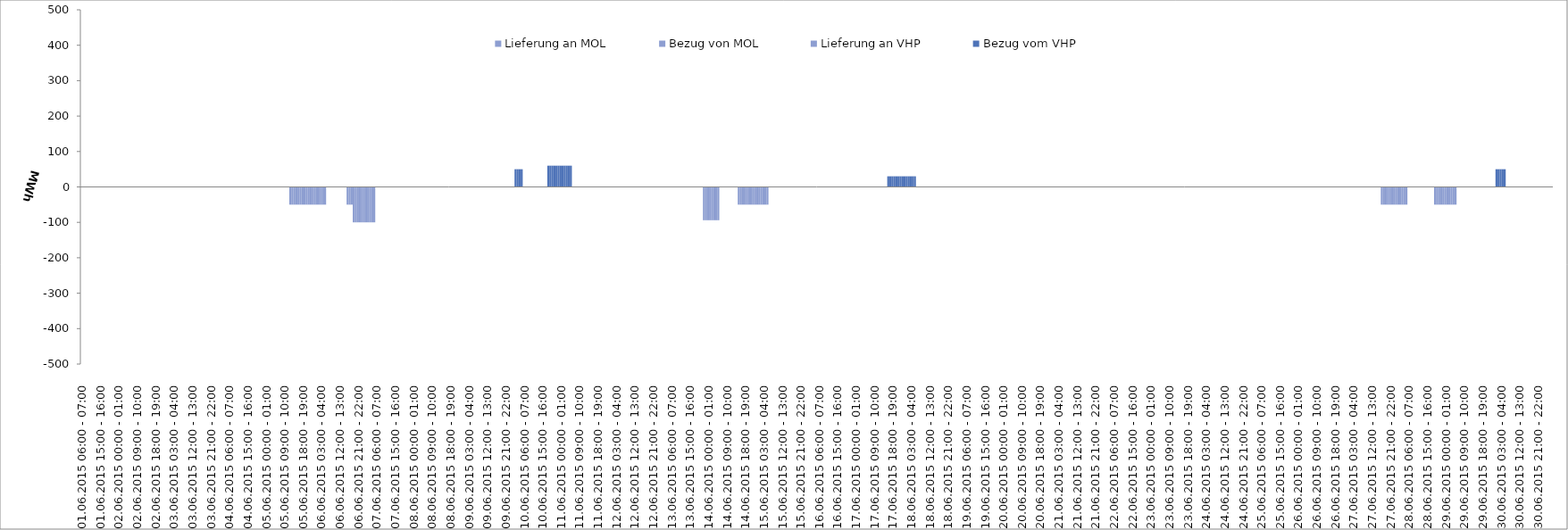
| Category | Bezug vom VHP | Lieferung an VHP | Bezug von MOL | Lieferung an MOL |
|---|---|---|---|---|
| 01.06.2015 06:00 - 07:00 | 0 | 0 | 0 | 0 |
| 01.06.2015 07:00 - 08:00 | 0 | 0 | 0 | 0 |
| 01.06.2015 08:00 - 09:00 | 0 | 0 | 0 | 0 |
| 01.06.2015 09:00 - 10:00 | 0 | 0 | 0 | 0 |
| 01.06.2015 10:00 - 11:00 | 0 | 0 | 0 | 0 |
| 01.06.2015 11:00 - 12:00 | 0 | 0 | 0 | 0 |
| 01.06.2015 12:00 - 13:00 | 0 | 0 | 0 | 0 |
| 01.06.2015 13:00 - 14:00 | 0 | 0 | 0 | 0 |
| 01.06.2015 14:00 - 15:00 | 0 | 0 | 0 | 0 |
| 01.06.2015 15:00 - 16:00 | 0 | 0 | 0 | 0 |
| 01.06.2015 16:00 - 17:00 | 0 | 0 | 0 | 0 |
| 01.06.2015 17:00 - 18:00 | 0 | 0 | 0 | 0 |
| 01.06.2015 18:00 - 19:00 | 0 | 0 | 0 | 0 |
| 01.06.2015 19:00 - 20:00 | 0 | 0 | 0 | 0 |
| 01.06.2015 20:00 - 21:00 | 0 | 0 | 0 | 0 |
| 01.06.2015 21:00 - 22:00 | 0 | 0 | 0 | 0 |
| 01.06.2015 22:00 - 23:00 | 0 | 0 | 0 | 0 |
| 01.06.2015 23:00 - 24:00 | 0 | 0 | 0 | 0 |
| 02.06.2015 00:00 - 01:00 | 0 | 0 | 0 | 0 |
| 02.06.2015 01:00 - 02:00 | 0 | 0 | 0 | 0 |
| 02.06.2015 02:00 - 03:00 | 0 | 0 | 0 | 0 |
| 02.06.2015 03:00 - 04:00 | 0 | 0 | 0 | 0 |
| 02.06.2015 04:00 - 05:00 | 0 | 0 | 0 | 0 |
| 02.06.2015 05:00 - 06:00 | 0 | 0 | 0 | 0 |
| 02.06.2015 06:00 - 07:00 | 0 | 0 | 0 | 0 |
| 02.06.2015 07:00 - 08:00 | 0 | 0 | 0 | 0 |
| 02.06.2015 08:00 - 09:00 | 0 | 0 | 0 | 0 |
| 02.06.2015 09:00 - 10:00 | 0 | 0 | 0 | 0 |
| 02.06.2015 10:00 - 11:00 | 0 | 0 | 0 | 0 |
| 02.06.2015 11:00 - 12:00 | 0 | 0 | 0 | 0 |
| 02.06.2015 12:00 - 13:00 | 0 | 0 | 0 | 0 |
| 02.06.2015 13:00 - 14:00 | 0 | 0 | 0 | 0 |
| 02.06.2015 14:00 - 15:00 | 0 | 0 | 0 | 0 |
| 02.06.2015 15:00 - 16:00 | 0 | 0 | 0 | 0 |
| 02.06.2015 16:00 - 17:00 | 0 | 0 | 0 | 0 |
| 02.06.2015 17:00 - 18:00 | 0 | 0 | 0 | 0 |
| 02.06.2015 18:00 - 19:00 | 0 | 0 | 0 | 0 |
| 02.06.2015 19:00 - 20:00 | 0 | 0 | 0 | 0 |
| 02.06.2015 20:00 - 21:00 | 0 | 0 | 0 | 0 |
| 02.06.2015 21:00 - 22:00 | 0 | 0 | 0 | 0 |
| 02.06.2015 22:00 - 23:00 | 0 | 0 | 0 | 0 |
| 02.06.2015 23:00 - 24:00 | 0 | 0 | 0 | 0 |
| 03.06.2015 00:00 - 01:00 | 0 | 0 | 0 | 0 |
| 03.06.2015 01:00 - 02:00 | 0 | 0 | 0 | 0 |
| 03.06.2015 02:00 - 03:00 | 0 | 0 | 0 | 0 |
| 03.06.2015 03:00 - 04:00 | 0 | 0 | 0 | 0 |
| 03.06.2015 04:00 - 05:00 | 0 | 0 | 0 | 0 |
| 03.06.2015 05:00 - 06:00 | 0 | 0 | 0 | 0 |
| 03.06.2015 06:00 - 07:00 | 0 | 0 | 0 | 0 |
| 03.06.2015 07:00 - 08:00 | 0 | 0 | 0 | 0 |
| 03.06.2015 08:00 - 09:00 | 0 | 0 | 0 | 0 |
| 03.06.2015 09:00 - 10:00 | 0 | 0 | 0 | 0 |
| 03.06.2015 10:00 - 11:00 | 0 | 0 | 0 | 0 |
| 03.06.2015 11:00 - 12:00 | 0 | 0 | 0 | 0 |
| 03.06.2015 12:00 - 13:00 | 0 | 0 | 0 | 0 |
| 03.06.2015 13:00 - 14:00 | 0 | 0 | 0 | 0 |
| 03.06.2015 14:00 - 15:00 | 0 | 0 | 0 | 0 |
| 03.06.2015 15:00 - 16:00 | 0 | 0 | 0 | 0 |
| 03.06.2015 16:00 - 17:00 | 0 | 0 | 0 | 0 |
| 03.06.2015 17:00 - 18:00 | 0 | 0 | 0 | 0 |
| 03.06.2015 18:00 - 19:00 | 0 | 0 | 0 | 0 |
| 03.06.2015 19:00 - 20:00 | 0 | 0 | 0 | 0 |
| 03.06.2015 20:00 - 21:00 | 0 | 0 | 0 | 0 |
| 03.06.2015 21:00 - 22:00 | 0 | 0 | 0 | 0 |
| 03.06.2015 22:00 - 23:00 | 0 | 0 | 0 | 0 |
| 03.06.2015 23:00 - 24:00 | 0 | 0 | 0 | 0 |
| 04.06.2015 00:00 - 01:00 | 0 | 0 | 0 | 0 |
| 04.06.2015 01:00 - 02:00 | 0 | 0 | 0 | 0 |
| 04.06.2015 02:00 - 03:00 | 0 | 0 | 0 | 0 |
| 04.06.2015 03:00 - 04:00 | 0 | 0 | 0 | 0 |
| 04.06.2015 04:00 - 05:00 | 0 | 0 | 0 | 0 |
| 04.06.2015 05:00 - 06:00 | 0 | 0 | 0 | 0 |
| 04.06.2015 06:00 - 07:00 | 0 | 0 | 0 | 0 |
| 04.06.2015 07:00 - 08:00 | 0 | 0 | 0 | 0 |
| 04.06.2015 08:00 - 09:00 | 0 | 0 | 0 | 0 |
| 04.06.2015 09:00 - 10:00 | 0 | 0 | 0 | 0 |
| 04.06.2015 10:00 - 11:00 | 0 | 0 | 0 | 0 |
| 04.06.2015 11:00 - 12:00 | 0 | 0 | 0 | 0 |
| 04.06.2015 12:00 - 13:00 | 0 | 0 | 0 | 0 |
| 04.06.2015 13:00 - 14:00 | 0 | 0 | 0 | 0 |
| 04.06.2015 14:00 - 15:00 | 0 | 0 | 0 | 0 |
| 04.06.2015 15:00 - 16:00 | 0 | 0 | 0 | 0 |
| 04.06.2015 16:00 - 17:00 | 0 | 0 | 0 | 0 |
| 04.06.2015 17:00 - 18:00 | 0 | 0 | 0 | 0 |
| 04.06.2015 18:00 - 19:00 | 0 | 0 | 0 | 0 |
| 04.06.2015 19:00 - 20:00 | 0 | 0 | 0 | 0 |
| 04.06.2015 20:00 - 21:00 | 0 | 0 | 0 | 0 |
| 04.06.2015 21:00 - 22:00 | 0 | 0 | 0 | 0 |
| 04.06.2015 22:00 - 23:00 | 0 | 0 | 0 | 0 |
| 04.06.2015 23:00 - 24:00 | 0 | 0 | 0 | 0 |
| 05.06.2015 00:00 - 01:00 | 0 | 0 | 0 | 0 |
| 05.06.2015 01:00 - 02:00 | 0 | 0 | 0 | 0 |
| 05.06.2015 02:00 - 03:00 | 0 | 0 | 0 | 0 |
| 05.06.2015 03:00 - 04:00 | 0 | 0 | 0 | 0 |
| 05.06.2015 04:00 - 05:00 | 0 | 0 | 0 | 0 |
| 05.06.2015 05:00 - 06:00 | 0 | 0 | 0 | 0 |
| 05.06.2015 06:00 - 07:00 | 0 | 0 | 0 | 0 |
| 05.06.2015 07:00 - 08:00 | 0 | 0 | 0 | 0 |
| 05.06.2015 08:00 - 09:00 | 0 | 0 | 0 | 0 |
| 05.06.2015 09:00 - 10:00 | 0 | 0 | 0 | 0 |
| 05.06.2015 10:00 - 11:00 | 0 | 0 | 0 | 0 |
| 05.06.2015 11:00 - 12:00 | 0 | 0 | 0 | 0 |
| 05.06.2015 12:00 - 13:00 | 0 | -50 | 0 | 0 |
| 05.06.2015 13:00 - 14:00 | 0 | -50 | 0 | 0 |
| 05.06.2015 14:00 - 15:00 | 0 | -50 | 0 | 0 |
| 05.06.2015 15:00 - 16:00 | 0 | -50 | 0 | 0 |
| 05.06.2015 16:00 - 17:00 | 0 | -50 | 0 | 0 |
| 05.06.2015 17:00 - 18:00 | 0 | -50 | 0 | 0 |
| 05.06.2015 18:00 - 19:00 | 0 | -50 | 0 | 0 |
| 05.06.2015 19:00 - 20:00 | 0 | -50 | 0 | 0 |
| 05.06.2015 20:00 - 21:00 | 0 | -50 | 0 | 0 |
| 05.06.2015 21:00 - 22:00 | 0 | -50 | 0 | 0 |
| 05.06.2015 22:00 - 23:00 | 0 | -50 | 0 | 0 |
| 05.06.2015 23:00 - 24:00 | 0 | -50 | 0 | 0 |
| 06.06.2015 00:00 - 01:00 | 0 | -50 | 0 | 0 |
| 06.06.2015 01:00 - 02:00 | 0 | -50 | 0 | 0 |
| 06.06.2015 02:00 - 03:00 | 0 | -50 | 0 | 0 |
| 06.06.2015 03:00 - 04:00 | 0 | -50 | 0 | 0 |
| 06.06.2015 04:00 - 05:00 | 0 | -50 | 0 | 0 |
| 06.06.2015 05:00 - 06:00 | 0 | -50 | 0 | 0 |
| 06.06.2015 06:00 - 07:00 | 0 | 0 | 0 | 0 |
| 06.06.2015 07:00 - 08:00 | 0 | 0 | 0 | 0 |
| 06.06.2015 08:00 - 09:00 | 0 | 0 | 0 | 0 |
| 06.06.2015 09:00 - 10:00 | 0 | 0 | 0 | 0 |
| 06.06.2015 10:00 - 11:00 | 0 | 0 | 0 | 0 |
| 06.06.2015 11:00 - 12:00 | 0 | 0 | 0 | 0 |
| 06.06.2015 12:00 - 13:00 | 0 | 0 | 0 | 0 |
| 06.06.2015 13:00 - 14:00 | 0 | 0 | 0 | 0 |
| 06.06.2015 14:00 - 15:00 | 0 | 0 | 0 | 0 |
| 06.06.2015 15:00 - 16:00 | 0 | 0 | 0 | 0 |
| 06.06.2015 16:00 - 17:00 | 0 | -50 | 0 | 0 |
| 06.06.2015 17:00 - 18:00 | 0 | -50 | 0 | 0 |
| 06.06.2015 18:00 - 19:00 | 0 | -50 | 0 | 0 |
| 06.06.2015 19:00 - 20:00 | 0 | -100 | 0 | 0 |
| 06.06.2015 20:00 - 21:00 | 0 | -100 | 0 | 0 |
| 06.06.2015 21:00 - 22:00 | 0 | -100 | 0 | 0 |
| 06.06.2015 22:00 - 23:00 | 0 | -100 | 0 | 0 |
| 06.06.2015 23:00 - 24:00 | 0 | -100 | 0 | 0 |
| 07.06.2015 00:00 - 01:00 | 0 | -100 | 0 | 0 |
| 07.06.2015 01:00 - 02:00 | 0 | -100 | 0 | 0 |
| 07.06.2015 02:00 - 03:00 | 0 | -100 | 0 | 0 |
| 07.06.2015 03:00 - 04:00 | 0 | -100 | 0 | 0 |
| 07.06.2015 04:00 - 05:00 | 0 | -100 | 0 | 0 |
| 07.06.2015 05:00 - 06:00 | 0 | -100 | 0 | 0 |
| 07.06.2015 06:00 - 07:00 | 0 | 0 | 0 | 0 |
| 07.06.2015 07:00 - 08:00 | 0 | 0 | 0 | 0 |
| 07.06.2015 08:00 - 09:00 | 0 | 0 | 0 | 0 |
| 07.06.2015 09:00 - 10:00 | 0 | 0 | 0 | 0 |
| 07.06.2015 10:00 - 11:00 | 0 | 0 | 0 | 0 |
| 07.06.2015 11:00 - 12:00 | 0 | 0 | 0 | 0 |
| 07.06.2015 12:00 - 13:00 | 0 | 0 | 0 | 0 |
| 07.06.2015 13:00 - 14:00 | 0 | 0 | 0 | 0 |
| 07.06.2015 14:00 - 15:00 | 0 | 0 | 0 | 0 |
| 07.06.2015 15:00 - 16:00 | 0 | 0 | 0 | 0 |
| 07.06.2015 16:00 - 17:00 | 0 | 0 | 0 | 0 |
| 07.06.2015 17:00 - 18:00 | 0 | 0 | 0 | 0 |
| 07.06.2015 18:00 - 19:00 | 0 | 0 | 0 | 0 |
| 07.06.2015 19:00 - 20:00 | 0 | 0 | 0 | 0 |
| 07.06.2015 20:00 - 21:00 | 0 | 0 | 0 | 0 |
| 07.06.2015 21:00 - 22:00 | 0 | 0 | 0 | 0 |
| 07.06.2015 22:00 - 23:00 | 0 | 0 | 0 | 0 |
| 07.06.2015 23:00 - 24:00 | 0 | 0 | 0 | 0 |
| 08.06.2015 00:00 - 01:00 | 0 | 0 | 0 | 0 |
| 08.06.2015 01:00 - 02:00 | 0 | 0 | 0 | 0 |
| 08.06.2015 02:00 - 03:00 | 0 | 0 | 0 | 0 |
| 08.06.2015 03:00 - 04:00 | 0 | 0 | 0 | 0 |
| 08.06.2015 04:00 - 05:00 | 0 | 0 | 0 | 0 |
| 08.06.2015 05:00 - 06:00 | 0 | 0 | 0 | 0 |
| 08.06.2015 06:00 - 07:00 | 0 | 0 | 0 | 0 |
| 08.06.2015 07:00 - 08:00 | 0 | 0 | 0 | 0 |
| 08.06.2015 08:00 - 09:00 | 0 | 0 | 0 | 0 |
| 08.06.2015 09:00 - 10:00 | 0 | 0 | 0 | 0 |
| 08.06.2015 10:00 - 11:00 | 0 | 0 | 0 | 0 |
| 08.06.2015 11:00 - 12:00 | 0 | 0 | 0 | 0 |
| 08.06.2015 12:00 - 13:00 | 0 | 0 | 0 | 0 |
| 08.06.2015 13:00 - 14:00 | 0 | 0 | 0 | 0 |
| 08.06.2015 14:00 - 15:00 | 0 | 0 | 0 | 0 |
| 08.06.2015 15:00 - 16:00 | 0 | 0 | 0 | 0 |
| 08.06.2015 16:00 - 17:00 | 0 | 0 | 0 | 0 |
| 08.06.2015 17:00 - 18:00 | 0 | 0 | 0 | 0 |
| 08.06.2015 18:00 - 19:00 | 0 | 0 | 0 | 0 |
| 08.06.2015 19:00 - 20:00 | 0 | 0 | 0 | 0 |
| 08.06.2015 20:00 - 21:00 | 0 | 0 | 0 | 0 |
| 08.06.2015 21:00 - 22:00 | 0 | 0 | 0 | 0 |
| 08.06.2015 22:00 - 23:00 | 0 | 0 | 0 | 0 |
| 08.06.2015 23:00 - 24:00 | 0 | 0 | 0 | 0 |
| 09.06.2015 00:00 - 01:00 | 0 | 0 | 0 | 0 |
| 09.06.2015 01:00 - 02:00 | 0 | 0 | 0 | 0 |
| 09.06.2015 02:00 - 03:00 | 0 | 0 | 0 | 0 |
| 09.06.2015 03:00 - 04:00 | 0 | 0 | 0 | 0 |
| 09.06.2015 04:00 - 05:00 | 0 | 0 | 0 | 0 |
| 09.06.2015 05:00 - 06:00 | 0 | 0 | 0 | 0 |
| 09.06.2015 06:00 - 07:00 | 0 | 0 | 0 | 0 |
| 09.06.2015 07:00 - 08:00 | 0 | 0 | 0 | 0 |
| 09.06.2015 08:00 - 09:00 | 0 | 0 | 0 | 0 |
| 09.06.2015 09:00 - 10:00 | 0 | 0 | 0 | 0 |
| 09.06.2015 10:00 - 11:00 | 0 | 0 | 0 | 0 |
| 09.06.2015 11:00 - 12:00 | 0 | 0 | 0 | 0 |
| 09.06.2015 12:00 - 13:00 | 0 | 0 | 0 | 0 |
| 09.06.2015 13:00 - 14:00 | 0 | 0 | 0 | 0 |
| 09.06.2015 14:00 - 15:00 | 0 | 0 | 0 | 0 |
| 09.06.2015 15:00 - 16:00 | 0 | 0 | 0 | 0 |
| 09.06.2015 16:00 - 17:00 | 0 | 0 | 0 | 0 |
| 09.06.2015 17:00 - 18:00 | 0 | 0 | 0 | 0 |
| 09.06.2015 18:00 - 19:00 | 0 | 0 | 0 | 0 |
| 09.06.2015 19:00 - 20:00 | 0 | 0 | 0 | 0 |
| 09.06.2015 20:00 - 21:00 | 0 | 0 | 0 | 0 |
| 09.06.2015 21:00 - 22:00 | 0 | 0 | 0 | 0 |
| 09.06.2015 22:00 - 23:00 | 0 | 0 | 0 | 0 |
| 09.06.2015 23:00 - 24:00 | 0 | 0 | 0 | 0 |
| 10.06.2015 00:00 - 01:00 | 0 | 0 | 0 | 0 |
| 10.06.2015 01:00 - 02:00 | 0 | 0 | 0 | 0 |
| 10.06.2015 02:00 - 03:00 | 50 | 0 | 0 | 0 |
| 10.06.2015 03:00 - 04:00 | 50 | 0 | 0 | 0 |
| 10.06.2015 04:00 - 05:00 | 50 | 0 | 0 | 0 |
| 10.06.2015 05:00 - 06:00 | 50 | 0 | 0 | 0 |
| 10.06.2015 06:00 - 07:00 | 0 | 0 | 0 | 0 |
| 10.06.2015 07:00 - 08:00 | 0 | 0 | 0 | 0 |
| 10.06.2015 08:00 - 09:00 | 0 | 0 | 0 | 0 |
| 10.06.2015 09:00 - 10:00 | 0 | 0 | 0 | 0 |
| 10.06.2015 10:00 - 11:00 | 0 | 0 | 0 | 0 |
| 10.06.2015 11:00 - 12:00 | 0 | 0 | 0 | 0 |
| 10.06.2015 12:00 - 13:00 | 0 | 0 | 0 | 0 |
| 10.06.2015 13:00 - 14:00 | 0 | 0 | 0 | 0 |
| 10.06.2015 14:00 - 15:00 | 0 | 0 | 0 | 0 |
| 10.06.2015 15:00 - 16:00 | 0 | 0 | 0 | 0 |
| 10.06.2015 16:00 - 17:00 | 0 | 0 | 0 | 0 |
| 10.06.2015 17:00 - 18:00 | 0 | 0 | 0 | 0 |
| 10.06.2015 18:00 - 19:00 | 60 | 0 | 0 | 0 |
| 10.06.2015 19:00 - 20:00 | 60 | 0 | 0 | 0 |
| 10.06.2015 20:00 - 21:00 | 60 | 0 | 0 | 0 |
| 10.06.2015 21:00 - 22:00 | 60 | 0 | 0 | 0 |
| 10.06.2015 22:00 - 23:00 | 60 | 0 | 0 | 0 |
| 10.06.2015 23:00 - 24:00 | 60 | 0 | 0 | 0 |
| 11.06.2015 00:00 - 01:00 | 60 | 0 | 0 | 0 |
| 11.06.2015 01:00 - 02:00 | 60 | 0 | 0 | 0 |
| 11.06.2015 02:00 - 03:00 | 60 | 0 | 0 | 0 |
| 11.06.2015 03:00 - 04:00 | 60 | 0 | 0 | 0 |
| 11.06.2015 04:00 - 05:00 | 60 | 0 | 0 | 0 |
| 11.06.2015 05:00 - 06:00 | 60 | 0 | 0 | 0 |
| 11.06.2015 06:00 - 07:00 | 0 | 0 | 0 | 0 |
| 11.06.2015 07:00 - 08:00 | 0 | 0 | 0 | 0 |
| 11.06.2015 08:00 - 09:00 | 0 | 0 | 0 | 0 |
| 11.06.2015 09:00 - 10:00 | 0 | 0 | 0 | 0 |
| 11.06.2015 10:00 - 11:00 | 0 | 0 | 0 | 0 |
| 11.06.2015 11:00 - 12:00 | 0 | 0 | 0 | 0 |
| 11.06.2015 12:00 - 13:00 | 0 | 0 | 0 | 0 |
| 11.06.2015 13:00 - 14:00 | 0 | 0 | 0 | 0 |
| 11.06.2015 14:00 - 15:00 | 0 | 0 | 0 | 0 |
| 11.06.2015 15:00 - 16:00 | 0 | 0 | 0 | 0 |
| 11.06.2015 16:00 - 17:00 | 0 | 0 | 0 | 0 |
| 11.06.2015 17:00 - 18:00 | 0 | 0 | 0 | 0 |
| 11.06.2015 18:00 - 19:00 | 0 | 0 | 0 | 0 |
| 11.06.2015 19:00 - 20:00 | 0 | 0 | 0 | 0 |
| 11.06.2015 20:00 - 21:00 | 0 | 0 | 0 | 0 |
| 11.06.2015 21:00 - 22:00 | 0 | 0 | 0 | 0 |
| 11.06.2015 22:00 - 23:00 | 0 | 0 | 0 | 0 |
| 11.06.2015 23:00 - 24:00 | 0 | 0 | 0 | 0 |
| 12.06.2015 00:00 - 01:00 | 0 | 0 | 0 | 0 |
| 12.06.2015 01:00 - 02:00 | 0 | 0 | 0 | 0 |
| 12.06.2015 02:00 - 03:00 | 0 | 0 | 0 | 0 |
| 12.06.2015 03:00 - 04:00 | 0 | 0 | 0 | 0 |
| 12.06.2015 04:00 - 05:00 | 0 | 0 | 0 | 0 |
| 12.06.2015 05:00 - 06:00 | 0 | 0 | 0 | 0 |
| 12.06.2015 06:00 - 07:00 | 0 | 0 | 0 | 0 |
| 12.06.2015 07:00 - 08:00 | 0 | 0 | 0 | 0 |
| 12.06.2015 08:00 - 09:00 | 0 | 0 | 0 | 0 |
| 12.06.2015 09:00 - 10:00 | 0 | 0 | 0 | 0 |
| 12.06.2015 10:00 - 11:00 | 0 | 0 | 0 | 0 |
| 12.06.2015 11:00 - 12:00 | 0 | 0 | 0 | 0 |
| 12.06.2015 12:00 - 13:00 | 0 | 0 | 0 | 0 |
| 12.06.2015 13:00 - 14:00 | 0 | 0 | 0 | 0 |
| 12.06.2015 14:00 - 15:00 | 0 | 0 | 0 | 0 |
| 12.06.2015 15:00 - 16:00 | 0 | 0 | 0 | 0 |
| 12.06.2015 16:00 - 17:00 | 0 | 0 | 0 | 0 |
| 12.06.2015 17:00 - 18:00 | 0 | 0 | 0 | 0 |
| 12.06.2015 18:00 - 19:00 | 0 | 0 | 0 | 0 |
| 12.06.2015 19:00 - 20:00 | 0 | 0 | 0 | 0 |
| 12.06.2015 20:00 - 21:00 | 0 | 0 | 0 | 0 |
| 12.06.2015 21:00 - 22:00 | 0 | 0 | 0 | 0 |
| 12.06.2015 22:00 - 23:00 | 0 | 0 | 0 | 0 |
| 12.06.2015 23:00 - 24:00 | 0 | 0 | 0 | 0 |
| 13.06.2015 00:00 - 01:00 | 0 | 0 | 0 | 0 |
| 13.06.2015 01:00 - 02:00 | 0 | 0 | 0 | 0 |
| 13.06.2015 02:00 - 03:00 | 0 | 0 | 0 | 0 |
| 13.06.2015 03:00 - 04:00 | 0 | 0 | 0 | 0 |
| 13.06.2015 04:00 - 05:00 | 0 | 0 | 0 | 0 |
| 13.06.2015 05:00 - 06:00 | 0 | 0 | 0 | 0 |
| 13.06.2015 06:00 - 07:00 | 0 | 0 | 0 | 0 |
| 13.06.2015 07:00 - 08:00 | 0 | 0 | 0 | 0 |
| 13.06.2015 08:00 - 09:00 | 0 | 0 | 0 | 0 |
| 13.06.2015 09:00 - 10:00 | 0 | 0 | 0 | 0 |
| 13.06.2015 10:00 - 11:00 | 0 | 0 | 0 | 0 |
| 13.06.2015 11:00 - 12:00 | 0 | 0 | 0 | 0 |
| 13.06.2015 12:00 - 13:00 | 0 | 0 | 0 | 0 |
| 13.06.2015 13:00 - 14:00 | 0 | 0 | 0 | 0 |
| 13.06.2015 14:00 - 15:00 | 0 | 0 | 0 | 0 |
| 13.06.2015 15:00 - 16:00 | 0 | 0 | 0 | 0 |
| 13.06.2015 16:00 - 17:00 | 0 | 0 | 0 | 0 |
| 13.06.2015 17:00 - 18:00 | 0 | 0 | 0 | 0 |
| 13.06.2015 18:00 - 19:00 | 0 | 0 | 0 | 0 |
| 13.06.2015 19:00 - 20:00 | 0 | 0 | 0 | 0 |
| 13.06.2015 20:00 - 21:00 | 0 | 0 | 0 | 0 |
| 13.06.2015 21:00 - 22:00 | 0 | 0 | 0 | 0 |
| 13.06.2015 22:00 - 23:00 | 0 | -94 | 0 | 0 |
| 13.06.2015 23:00 - 24:00 | 0 | -94 | 0 | 0 |
| 14.06.2015 00:00 - 01:00 | 0 | -94 | 0 | 0 |
| 14.06.2015 01:00 - 02:00 | 0 | -94 | 0 | 0 |
| 14.06.2015 02:00 - 03:00 | 0 | -94 | 0 | 0 |
| 14.06.2015 03:00 - 04:00 | 0 | -94 | 0 | 0 |
| 14.06.2015 04:00 - 05:00 | 0 | -94 | 0 | 0 |
| 14.06.2015 05:00 - 06:00 | 0 | -94 | 0 | 0 |
| 14.06.2015 06:00 - 07:00 | 0 | 0 | 0 | 0 |
| 14.06.2015 07:00 - 08:00 | 0 | 0 | 0 | 0 |
| 14.06.2015 08:00 - 09:00 | 0 | 0 | 0 | 0 |
| 14.06.2015 09:00 - 10:00 | 0 | 0 | 0 | 0 |
| 14.06.2015 10:00 - 11:00 | 0 | 0 | 0 | 0 |
| 14.06.2015 11:00 - 12:00 | 0 | 0 | 0 | 0 |
| 14.06.2015 12:00 - 13:00 | 0 | 0 | 0 | 0 |
| 14.06.2015 13:00 - 14:00 | 0 | 0 | 0 | 0 |
| 14.06.2015 14:00 - 15:00 | 0 | 0 | 0 | 0 |
| 14.06.2015 15:00 - 16:00 | 0 | -50 | 0 | 0 |
| 14.06.2015 16:00 - 17:00 | 0 | -50 | 0 | 0 |
| 14.06.2015 17:00 - 18:00 | 0 | -50 | 0 | 0 |
| 14.06.2015 18:00 - 19:00 | 0 | -50 | 0 | 0 |
| 14.06.2015 19:00 - 20:00 | 0 | -50 | 0 | 0 |
| 14.06.2015 20:00 - 21:00 | 0 | -50 | 0 | 0 |
| 14.06.2015 21:00 - 22:00 | 0 | -50 | 0 | 0 |
| 14.06.2015 22:00 - 23:00 | 0 | -50 | 0 | 0 |
| 14.06.2015 23:00 - 24:00 | 0 | -50 | 0 | 0 |
| 15.06.2015 00:00 - 01:00 | 0 | -50 | 0 | 0 |
| 15.06.2015 01:00 - 02:00 | 0 | -50 | 0 | 0 |
| 15.06.2015 02:00 - 03:00 | 0 | -50 | 0 | 0 |
| 15.06.2015 03:00 - 04:00 | 0 | -50 | 0 | 0 |
| 15.06.2015 04:00 - 05:00 | 0 | -50 | 0 | 0 |
| 15.06.2015 05:00 - 06:00 | 0 | -50 | 0 | 0 |
| 15.06.2015 06:00 - 07:00 | 0 | 0 | 0 | 0 |
| 15.06.2015 07:00 - 08:00 | 0 | 0 | 0 | 0 |
| 15.06.2015 08:00 - 09:00 | 0 | 0 | 0 | 0 |
| 15.06.2015 09:00 - 10:00 | 0 | 0 | 0 | 0 |
| 15.06.2015 10:00 - 11:00 | 0 | 0 | 0 | 0 |
| 15.06.2015 11:00 - 12:00 | 0 | 0 | 0 | 0 |
| 15.06.2015 12:00 - 13:00 | 0 | 0 | 0 | 0 |
| 15.06.2015 13:00 - 14:00 | 0 | 0 | 0 | 0 |
| 15.06.2015 14:00 - 15:00 | 0 | 0 | 0 | 0 |
| 15.06.2015 15:00 - 16:00 | 0 | 0 | 0 | 0 |
| 15.06.2015 16:00 - 17:00 | 0 | 0 | 0 | 0 |
| 15.06.2015 17:00 - 18:00 | 0 | 0 | 0 | 0 |
| 15.06.2015 18:00 - 19:00 | 0 | 0 | 0 | 0 |
| 15.06.2015 19:00 - 20:00 | 0 | 0 | 0 | 0 |
| 15.06.2015 20:00 - 21:00 | 0 | 0 | 0 | 0 |
| 15.06.2015 21:00 - 22:00 | 0 | 0 | 0 | 0 |
| 15.06.2015 22:00 - 23:00 | 0 | 0 | 0 | 0 |
| 15.06.2015 23:00 - 24:00 | 0 | 0 | 0 | 0 |
| 16.06.2015 00:00 - 01:00 | 0 | 0 | 0 | 0 |
| 16.06.2015 01:00 - 02:00 | 0 | 0 | 0 | 0 |
| 16.06.2015 02:00 - 03:00 | 0 | 0 | 0 | 0 |
| 16.06.2015 03:00 - 04:00 | 0 | 0 | 0 | 0 |
| 16.06.2015 04:00 - 05:00 | 0 | 0 | 0 | 0 |
| 16.06.2015 05:00 - 06:00 | 0 | 0 | 0 | 0 |
| 16.06.2015 06:00 - 07:00 | 0 | 0 | 0 | 0 |
| 16.06.2015 07:00 - 08:00 | 0 | 0 | 0 | 0 |
| 16.06.2015 08:00 - 09:00 | 0 | 0 | 0 | 0 |
| 16.06.2015 09:00 - 10:00 | 0 | 0 | 0 | 0 |
| 16.06.2015 10:00 - 11:00 | 0 | 0 | 0 | 0 |
| 16.06.2015 11:00 - 12:00 | 0 | 0 | 0 | 0 |
| 16.06.2015 12:00 - 13:00 | 0 | 0 | 0 | 0 |
| 16.06.2015 13:00 - 14:00 | 0 | 0 | 0 | 0 |
| 16.06.2015 14:00 - 15:00 | 0 | 0 | 0 | 0 |
| 16.06.2015 15:00 - 16:00 | 0 | 0 | 0 | 0 |
| 16.06.2015 16:00 - 17:00 | 0 | 0 | 0 | 0 |
| 16.06.2015 17:00 - 18:00 | 0 | 0 | 0 | 0 |
| 16.06.2015 18:00 - 19:00 | 0 | 0 | 0 | 0 |
| 16.06.2015 19:00 - 20:00 | 0 | 0 | 0 | 0 |
| 16.06.2015 20:00 - 21:00 | 0 | 0 | 0 | 0 |
| 16.06.2015 21:00 - 22:00 | 0 | 0 | 0 | 0 |
| 16.06.2015 22:00 - 23:00 | 0 | 0 | 0 | 0 |
| 16.06.2015 23:00 - 24:00 | 0 | 0 | 0 | 0 |
| 17.06.2015 00:00 - 01:00 | 0 | 0 | 0 | 0 |
| 17.06.2015 01:00 - 02:00 | 0 | 0 | 0 | 0 |
| 17.06.2015 02:00 - 03:00 | 0 | 0 | 0 | 0 |
| 17.06.2015 03:00 - 04:00 | 0 | 0 | 0 | 0 |
| 17.06.2015 04:00 - 05:00 | 0 | 0 | 0 | 0 |
| 17.06.2015 05:00 - 06:00 | 0 | 0 | 0 | 0 |
| 17.06.2015 06:00 - 07:00 | 0 | 0 | 0 | 0 |
| 17.06.2015 07:00 - 08:00 | 0 | 0 | 0 | 0 |
| 17.06.2015 08:00 - 09:00 | 0 | 0 | 0 | 0 |
| 17.06.2015 09:00 - 10:00 | 0 | 0 | 0 | 0 |
| 17.06.2015 10:00 - 11:00 | 0 | 0 | 0 | 0 |
| 17.06.2015 11:00 - 12:00 | 0 | 0 | 0 | 0 |
| 17.06.2015 12:00 - 13:00 | 0 | 0 | 0 | 0 |
| 17.06.2015 13:00 - 14:00 | 0 | 0 | 0 | 0 |
| 17.06.2015 14:00 - 15:00 | 0 | 0 | 0 | 0 |
| 17.06.2015 15:00 - 16:00 | 0 | 0 | 0 | 0 |
| 17.06.2015 16:00 - 17:00 | 30 | 0 | 0 | 0 |
| 17.06.2015 17:00 - 18:00 | 30 | 0 | 0 | 0 |
| 17.06.2015 18:00 - 19:00 | 30 | 0 | 0 | 0 |
| 17.06.2015 19:00 - 20:00 | 30 | 0 | 0 | 0 |
| 17.06.2015 20:00 - 21:00 | 30 | 0 | 0 | 0 |
| 17.06.2015 21:00 - 22:00 | 30 | 0 | 0 | 0 |
| 17.06.2015 22:00 - 23:00 | 30 | 0 | 0 | 0 |
| 17.06.2015 23:00 - 24:00 | 30 | 0 | 0 | 0 |
| 18.06.2015 00:00 - 01:00 | 30 | 0 | 0 | 0 |
| 18.06.2015 01:00 - 02:00 | 30 | 0 | 0 | 0 |
| 18.06.2015 02:00 - 03:00 | 30 | 0 | 0 | 0 |
| 18.06.2015 03:00 - 04:00 | 30 | 0 | 0 | 0 |
| 18.06.2015 04:00 - 05:00 | 30 | 0 | 0 | 0 |
| 18.06.2015 05:00 - 06:00 | 30 | 0 | 0 | 0 |
| 18.06.2015 06:00 - 07:00 | 0 | 0 | 0 | 0 |
| 18.06.2015 07:00 - 08:00 | 0 | 0 | 0 | 0 |
| 18.06.2015 08:00 - 09:00 | 0 | 0 | 0 | 0 |
| 18.06.2015 09:00 - 10:00 | 0 | 0 | 0 | 0 |
| 18.06.2015 10:00 - 11:00 | 0 | 0 | 0 | 0 |
| 18.06.2015 11:00 - 12:00 | 0 | 0 | 0 | 0 |
| 18.06.2015 12:00 - 13:00 | 0 | 0 | 0 | 0 |
| 18.06.2015 13:00 - 14:00 | 0 | 0 | 0 | 0 |
| 18.06.2015 14:00 - 15:00 | 0 | 0 | 0 | 0 |
| 18.06.2015 15:00 - 16:00 | 0 | 0 | 0 | 0 |
| 18.06.2015 16:00 - 17:00 | 0 | 0 | 0 | 0 |
| 18.06.2015 17:00 - 18:00 | 0 | 0 | 0 | 0 |
| 18.06.2015 18:00 - 19:00 | 0 | 0 | 0 | 0 |
| 18.06.2015 19:00 - 20:00 | 0 | 0 | 0 | 0 |
| 18.06.2015 20:00 - 21:00 | 0 | 0 | 0 | 0 |
| 18.06.2015 21:00 - 22:00 | 0 | 0 | 0 | 0 |
| 18.06.2015 22:00 - 23:00 | 0 | 0 | 0 | 0 |
| 18.06.2015 23:00 - 24:00 | 0 | 0 | 0 | 0 |
| 19.06.2015 00:00 - 01:00 | 0 | 0 | 0 | 0 |
| 19.06.2015 01:00 - 02:00 | 0 | 0 | 0 | 0 |
| 19.06.2015 02:00 - 03:00 | 0 | 0 | 0 | 0 |
| 19.06.2015 03:00 - 04:00 | 0 | 0 | 0 | 0 |
| 19.06.2015 04:00 - 05:00 | 0 | 0 | 0 | 0 |
| 19.06.2015 05:00 - 06:00 | 0 | 0 | 0 | 0 |
| 19.06.2015 06:00 - 07:00 | 0 | 0 | 0 | 0 |
| 19.06.2015 07:00 - 08:00 | 0 | 0 | 0 | 0 |
| 19.06.2015 08:00 - 09:00 | 0 | 0 | 0 | 0 |
| 19.06.2015 09:00 - 10:00 | 0 | 0 | 0 | 0 |
| 19.06.2015 10:00 - 11:00 | 0 | 0 | 0 | 0 |
| 19.06.2015 11:00 - 12:00 | 0 | 0 | 0 | 0 |
| 19.06.2015 12:00 - 13:00 | 0 | 0 | 0 | 0 |
| 19.06.2015 13:00 - 14:00 | 0 | 0 | 0 | 0 |
| 19.06.2015 14:00 - 15:00 | 0 | 0 | 0 | 0 |
| 19.06.2015 15:00 - 16:00 | 0 | 0 | 0 | 0 |
| 19.06.2015 16:00 - 17:00 | 0 | 0 | 0 | 0 |
| 19.06.2015 17:00 - 18:00 | 0 | 0 | 0 | 0 |
| 19.06.2015 18:00 - 19:00 | 0 | 0 | 0 | 0 |
| 19.06.2015 19:00 - 20:00 | 0 | 0 | 0 | 0 |
| 19.06.2015 20:00 - 21:00 | 0 | 0 | 0 | 0 |
| 19.06.2015 21:00 - 22:00 | 0 | 0 | 0 | 0 |
| 19.06.2015 22:00 - 23:00 | 0 | 0 | 0 | 0 |
| 19.06.2015 23:00 - 24:00 | 0 | 0 | 0 | 0 |
| 20.06.2015 00:00 - 01:00 | 0 | 0 | 0 | 0 |
| 20.06.2015 01:00 - 02:00 | 0 | 0 | 0 | 0 |
| 20.06.2015 02:00 - 03:00 | 0 | 0 | 0 | 0 |
| 20.06.2015 03:00 - 04:00 | 0 | 0 | 0 | 0 |
| 20.06.2015 04:00 - 05:00 | 0 | 0 | 0 | 0 |
| 20.06.2015 05:00 - 06:00 | 0 | 0 | 0 | 0 |
| 20.06.2015 06:00 - 07:00 | 0 | 0 | 0 | 0 |
| 20.06.2015 07:00 - 08:00 | 0 | 0 | 0 | 0 |
| 20.06.2015 08:00 - 09:00 | 0 | 0 | 0 | 0 |
| 20.06.2015 09:00 - 10:00 | 0 | 0 | 0 | 0 |
| 20.06.2015 10:00 - 11:00 | 0 | 0 | 0 | 0 |
| 20.06.2015 11:00 - 12:00 | 0 | 0 | 0 | 0 |
| 20.06.2015 12:00 - 13:00 | 0 | 0 | 0 | 0 |
| 20.06.2015 13:00 - 14:00 | 0 | 0 | 0 | 0 |
| 20.06.2015 14:00 - 15:00 | 0 | 0 | 0 | 0 |
| 20.06.2015 15:00 - 16:00 | 0 | 0 | 0 | 0 |
| 20.06.2015 16:00 - 17:00 | 0 | 0 | 0 | 0 |
| 20.06.2015 17:00 - 18:00 | 0 | 0 | 0 | 0 |
| 20.06.2015 18:00 - 19:00 | 0 | 0 | 0 | 0 |
| 20.06.2015 19:00 - 20:00 | 0 | 0 | 0 | 0 |
| 20.06.2015 20:00 - 21:00 | 0 | 0 | 0 | 0 |
| 20.06.2015 21:00 - 22:00 | 0 | 0 | 0 | 0 |
| 20.06.2015 22:00 - 23:00 | 0 | 0 | 0 | 0 |
| 20.06.2015 23:00 - 24:00 | 0 | 0 | 0 | 0 |
| 21.06.2015 00:00 - 01:00 | 0 | 0 | 0 | 0 |
| 21.06.2015 01:00 - 02:00 | 0 | 0 | 0 | 0 |
| 21.06.2015 02:00 - 03:00 | 0 | 0 | 0 | 0 |
| 21.06.2015 03:00 - 04:00 | 0 | 0 | 0 | 0 |
| 21.06.2015 04:00 - 05:00 | 0 | 0 | 0 | 0 |
| 21.06.2015 05:00 - 06:00 | 0 | 0 | 0 | 0 |
| 21.06.2015 06:00 - 07:00 | 0 | 0 | 0 | 0 |
| 21.06.2015 07:00 - 08:00 | 0 | 0 | 0 | 0 |
| 21.06.2015 08:00 - 09:00 | 0 | 0 | 0 | 0 |
| 21.06.2015 09:00 - 10:00 | 0 | 0 | 0 | 0 |
| 21.06.2015 10:00 - 11:00 | 0 | 0 | 0 | 0 |
| 21.06.2015 11:00 - 12:00 | 0 | 0 | 0 | 0 |
| 21.06.2015 12:00 - 13:00 | 0 | 0 | 0 | 0 |
| 21.06.2015 13:00 - 14:00 | 0 | 0 | 0 | 0 |
| 21.06.2015 14:00 - 15:00 | 0 | 0 | 0 | 0 |
| 21.06.2015 15:00 - 16:00 | 0 | 0 | 0 | 0 |
| 21.06.2015 16:00 - 17:00 | 0 | 0 | 0 | 0 |
| 21.06.2015 17:00 - 18:00 | 0 | 0 | 0 | 0 |
| 21.06.2015 18:00 - 19:00 | 0 | 0 | 0 | 0 |
| 21.06.2015 19:00 - 20:00 | 0 | 0 | 0 | 0 |
| 21.06.2015 20:00 - 21:00 | 0 | 0 | 0 | 0 |
| 21.06.2015 21:00 - 22:00 | 0 | 0 | 0 | 0 |
| 21.06.2015 22:00 - 23:00 | 0 | 0 | 0 | 0 |
| 21.06.2015 23:00 - 24:00 | 0 | 0 | 0 | 0 |
| 22.06.2015 00:00 - 01:00 | 0 | 0 | 0 | 0 |
| 22.06.2015 01:00 - 02:00 | 0 | 0 | 0 | 0 |
| 22.06.2015 02:00 - 03:00 | 0 | 0 | 0 | 0 |
| 22.06.2015 03:00 - 04:00 | 0 | 0 | 0 | 0 |
| 22.06.2015 04:00 - 05:00 | 0 | 0 | 0 | 0 |
| 22.06.2015 05:00 - 06:00 | 0 | 0 | 0 | 0 |
| 22.06.2015 06:00 - 07:00 | 0 | 0 | 0 | 0 |
| 22.06.2015 07:00 - 08:00 | 0 | 0 | 0 | 0 |
| 22.06.2015 08:00 - 09:00 | 0 | 0 | 0 | 0 |
| 22.06.2015 09:00 - 10:00 | 0 | 0 | 0 | 0 |
| 22.06.2015 10:00 - 11:00 | 0 | 0 | 0 | 0 |
| 22.06.2015 11:00 - 12:00 | 0 | 0 | 0 | 0 |
| 22.06.2015 12:00 - 13:00 | 0 | 0 | 0 | 0 |
| 22.06.2015 13:00 - 14:00 | 0 | 0 | 0 | 0 |
| 22.06.2015 14:00 - 15:00 | 0 | 0 | 0 | 0 |
| 22.06.2015 15:00 - 16:00 | 0 | 0 | 0 | 0 |
| 22.06.2015 16:00 - 17:00 | 0 | 0 | 0 | 0 |
| 22.06.2015 17:00 - 18:00 | 0 | 0 | 0 | 0 |
| 22.06.2015 18:00 - 19:00 | 0 | 0 | 0 | 0 |
| 22.06.2015 19:00 - 20:00 | 0 | 0 | 0 | 0 |
| 22.06.2015 20:00 - 21:00 | 0 | 0 | 0 | 0 |
| 22.06.2015 21:00 - 22:00 | 0 | 0 | 0 | 0 |
| 22.06.2015 22:00 - 23:00 | 0 | 0 | 0 | 0 |
| 22.06.2015 23:00 - 24:00 | 0 | 0 | 0 | 0 |
| 23.06.2015 00:00 - 01:00 | 0 | 0 | 0 | 0 |
| 23.06.2015 01:00 - 02:00 | 0 | 0 | 0 | 0 |
| 23.06.2015 02:00 - 03:00 | 0 | 0 | 0 | 0 |
| 23.06.2015 03:00 - 04:00 | 0 | 0 | 0 | 0 |
| 23.06.2015 04:00 - 05:00 | 0 | 0 | 0 | 0 |
| 23.06.2015 05:00 - 06:00 | 0 | 0 | 0 | 0 |
| 23.06.2015 06:00 - 07:00 | 0 | 0 | 0 | 0 |
| 23.06.2015 07:00 - 08:00 | 0 | 0 | 0 | 0 |
| 23.06.2015 08:00 - 09:00 | 0 | 0 | 0 | 0 |
| 23.06.2015 09:00 - 10:00 | 0 | 0 | 0 | 0 |
| 23.06.2015 10:00 - 11:00 | 0 | 0 | 0 | 0 |
| 23.06.2015 11:00 - 12:00 | 0 | 0 | 0 | 0 |
| 23.06.2015 12:00 - 13:00 | 0 | 0 | 0 | 0 |
| 23.06.2015 13:00 - 14:00 | 0 | 0 | 0 | 0 |
| 23.06.2015 14:00 - 15:00 | 0 | 0 | 0 | 0 |
| 23.06.2015 15:00 - 16:00 | 0 | 0 | 0 | 0 |
| 23.06.2015 16:00 - 17:00 | 0 | 0 | 0 | 0 |
| 23.06.2015 17:00 - 18:00 | 0 | 0 | 0 | 0 |
| 23.06.2015 18:00 - 19:00 | 0 | 0 | 0 | 0 |
| 23.06.2015 19:00 - 20:00 | 0 | 0 | 0 | 0 |
| 23.06.2015 20:00 - 21:00 | 0 | 0 | 0 | 0 |
| 23.06.2015 21:00 - 22:00 | 0 | 0 | 0 | 0 |
| 23.06.2015 22:00 - 23:00 | 0 | 0 | 0 | 0 |
| 23.06.2015 23:00 - 24:00 | 0 | 0 | 0 | 0 |
| 24.06.2015 00:00 - 01:00 | 0 | 0 | 0 | 0 |
| 24.06.2015 01:00 - 02:00 | 0 | 0 | 0 | 0 |
| 24.06.2015 02:00 - 03:00 | 0 | 0 | 0 | 0 |
| 24.06.2015 03:00 - 04:00 | 0 | 0 | 0 | 0 |
| 24.06.2015 04:00 - 05:00 | 0 | 0 | 0 | 0 |
| 24.06.2015 05:00 - 06:00 | 0 | 0 | 0 | 0 |
| 24.06.2015 06:00 - 07:00 | 0 | 0 | 0 | 0 |
| 24.06.2015 07:00 - 08:00 | 0 | 0 | 0 | 0 |
| 24.06.2015 08:00 - 09:00 | 0 | 0 | 0 | 0 |
| 24.06.2015 09:00 - 10:00 | 0 | 0 | 0 | 0 |
| 24.06.2015 10:00 - 11:00 | 0 | 0 | 0 | 0 |
| 24.06.2015 11:00 - 12:00 | 0 | 0 | 0 | 0 |
| 24.06.2015 12:00 - 13:00 | 0 | 0 | 0 | 0 |
| 24.06.2015 13:00 - 14:00 | 0 | 0 | 0 | 0 |
| 24.06.2015 14:00 - 15:00 | 0 | 0 | 0 | 0 |
| 24.06.2015 15:00 - 16:00 | 0 | 0 | 0 | 0 |
| 24.06.2015 16:00 - 17:00 | 0 | 0 | 0 | 0 |
| 24.06.2015 17:00 - 18:00 | 0 | 0 | 0 | 0 |
| 24.06.2015 18:00 - 19:00 | 0 | 0 | 0 | 0 |
| 24.06.2015 19:00 - 20:00 | 0 | 0 | 0 | 0 |
| 24.06.2015 20:00 - 21:00 | 0 | 0 | 0 | 0 |
| 24.06.2015 21:00 - 22:00 | 0 | 0 | 0 | 0 |
| 24.06.2015 22:00 - 23:00 | 0 | 0 | 0 | 0 |
| 24.06.2015 23:00 - 24:00 | 0 | 0 | 0 | 0 |
| 25.06.2015 00:00 - 01:00 | 0 | 0 | 0 | 0 |
| 25.06.2015 01:00 - 02:00 | 0 | 0 | 0 | 0 |
| 25.06.2015 02:00 - 03:00 | 0 | 0 | 0 | 0 |
| 25.06.2015 03:00 - 04:00 | 0 | 0 | 0 | 0 |
| 25.06.2015 04:00 - 05:00 | 0 | 0 | 0 | 0 |
| 25.06.2015 05:00 - 06:00 | 0 | 0 | 0 | 0 |
| 25.06.2015 06:00 - 07:00 | 0 | 0 | 0 | 0 |
| 25.06.2015 07:00 - 08:00 | 0 | 0 | 0 | 0 |
| 25.06.2015 08:00 - 09:00 | 0 | 0 | 0 | 0 |
| 25.06.2015 09:00 - 10:00 | 0 | 0 | 0 | 0 |
| 25.06.2015 10:00 - 11:00 | 0 | 0 | 0 | 0 |
| 25.06.2015 11:00 - 12:00 | 0 | 0 | 0 | 0 |
| 25.06.2015 12:00 - 13:00 | 0 | 0 | 0 | 0 |
| 25.06.2015 13:00 - 14:00 | 0 | 0 | 0 | 0 |
| 25.06.2015 14:00 - 15:00 | 0 | 0 | 0 | 0 |
| 25.06.2015 15:00 - 16:00 | 0 | 0 | 0 | 0 |
| 25.06.2015 16:00 - 17:00 | 0 | 0 | 0 | 0 |
| 25.06.2015 17:00 - 18:00 | 0 | 0 | 0 | 0 |
| 25.06.2015 18:00 - 19:00 | 0 | 0 | 0 | 0 |
| 25.06.2015 19:00 - 20:00 | 0 | 0 | 0 | 0 |
| 25.06.2015 20:00 - 21:00 | 0 | 0 | 0 | 0 |
| 25.06.2015 21:00 - 22:00 | 0 | 0 | 0 | 0 |
| 25.06.2015 22:00 - 23:00 | 0 | 0 | 0 | 0 |
| 25.06.2015 23:00 - 24:00 | 0 | 0 | 0 | 0 |
| 26.06.2015 00:00 - 01:00 | 0 | 0 | 0 | 0 |
| 26.06.2015 01:00 - 02:00 | 0 | 0 | 0 | 0 |
| 26.06.2015 02:00 - 03:00 | 0 | 0 | 0 | 0 |
| 26.06.2015 03:00 - 04:00 | 0 | 0 | 0 | 0 |
| 26.06.2015 04:00 - 05:00 | 0 | 0 | 0 | 0 |
| 26.06.2015 05:00 - 06:00 | 0 | 0 | 0 | 0 |
| 26.06.2015 06:00 - 07:00 | 0 | 0 | 0 | 0 |
| 26.06.2015 07:00 - 08:00 | 0 | 0 | 0 | 0 |
| 26.06.2015 08:00 - 09:00 | 0 | 0 | 0 | 0 |
| 26.06.2015 09:00 - 10:00 | 0 | 0 | 0 | 0 |
| 26.06.2015 10:00 - 11:00 | 0 | 0 | 0 | 0 |
| 26.06.2015 11:00 - 12:00 | 0 | 0 | 0 | 0 |
| 26.06.2015 12:00 - 13:00 | 0 | 0 | 0 | 0 |
| 26.06.2015 13:00 - 14:00 | 0 | 0 | 0 | 0 |
| 26.06.2015 14:00 - 15:00 | 0 | 0 | 0 | 0 |
| 26.06.2015 15:00 - 16:00 | 0 | 0 | 0 | 0 |
| 26.06.2015 16:00 - 17:00 | 0 | 0 | 0 | 0 |
| 26.06.2015 17:00 - 18:00 | 0 | 0 | 0 | 0 |
| 26.06.2015 18:00 - 19:00 | 0 | 0 | 0 | 0 |
| 26.06.2015 19:00 - 20:00 | 0 | 0 | 0 | 0 |
| 26.06.2015 20:00 - 21:00 | 0 | 0 | 0 | 0 |
| 26.06.2015 21:00 - 22:00 | 0 | 0 | 0 | 0 |
| 26.06.2015 22:00 - 23:00 | 0 | 0 | 0 | 0 |
| 26.06.2015 23:00 - 24:00 | 0 | 0 | 0 | 0 |
| 27.06.2015 00:00 - 01:00 | 0 | 0 | 0 | 0 |
| 27.06.2015 01:00 - 02:00 | 0 | 0 | 0 | 0 |
| 27.06.2015 02:00 - 03:00 | 0 | 0 | 0 | 0 |
| 27.06.2015 03:00 - 04:00 | 0 | 0 | 0 | 0 |
| 27.06.2015 04:00 - 05:00 | 0 | 0 | 0 | 0 |
| 27.06.2015 05:00 - 06:00 | 0 | 0 | 0 | 0 |
| 27.06.2015 06:00 - 07:00 | 0 | 0 | 0 | 0 |
| 27.06.2015 07:00 - 08:00 | 0 | 0 | 0 | 0 |
| 27.06.2015 08:00 - 09:00 | 0 | 0 | 0 | 0 |
| 27.06.2015 09:00 - 10:00 | 0 | 0 | 0 | 0 |
| 27.06.2015 10:00 - 11:00 | 0 | 0 | 0 | 0 |
| 27.06.2015 11:00 - 12:00 | 0 | 0 | 0 | 0 |
| 27.06.2015 12:00 - 13:00 | 0 | 0 | 0 | 0 |
| 27.06.2015 13:00 - 14:00 | 0 | 0 | 0 | 0 |
| 27.06.2015 14:00 - 15:00 | 0 | 0 | 0 | 0 |
| 27.06.2015 15:00 - 16:00 | 0 | 0 | 0 | 0 |
| 27.06.2015 16:00 - 17:00 | 0 | 0 | 0 | 0 |
| 27.06.2015 17:00 - 18:00 | 0 | -50 | 0 | 0 |
| 27.06.2015 18:00 - 19:00 | 0 | -50 | 0 | 0 |
| 27.06.2015 19:00 - 20:00 | 0 | -50 | 0 | 0 |
| 27.06.2015 20:00 - 21:00 | 0 | -50 | 0 | 0 |
| 27.06.2015 21:00 - 22:00 | 0 | -50 | 0 | 0 |
| 27.06.2015 22:00 - 23:00 | 0 | -50 | 0 | 0 |
| 27.06.2015 23:00 - 24:00 | 0 | -50 | 0 | 0 |
| 28.06.2015 00:00 - 01:00 | 0 | -50 | 0 | 0 |
| 28.06.2015 01:00 - 02:00 | 0 | -50 | 0 | 0 |
| 28.06.2015 02:00 - 03:00 | 0 | -50 | 0 | 0 |
| 28.06.2015 03:00 - 04:00 | 0 | -50 | 0 | 0 |
| 28.06.2015 04:00 - 05:00 | 0 | -50 | 0 | 0 |
| 28.06.2015 05:00 - 06:00 | 0 | -50 | 0 | 0 |
| 28.06.2015 06:00 - 07:00 | 0 | 0 | 0 | 0 |
| 28.06.2015 07:00 - 08:00 | 0 | 0 | 0 | 0 |
| 28.06.2015 08:00 - 09:00 | 0 | 0 | 0 | 0 |
| 28.06.2015 09:00 - 10:00 | 0 | 0 | 0 | 0 |
| 28.06.2015 10:00 - 11:00 | 0 | 0 | 0 | 0 |
| 28.06.2015 11:00 - 12:00 | 0 | 0 | 0 | 0 |
| 28.06.2015 12:00 - 13:00 | 0 | 0 | 0 | 0 |
| 28.06.2015 13:00 - 14:00 | 0 | 0 | 0 | 0 |
| 28.06.2015 14:00 - 15:00 | 0 | 0 | 0 | 0 |
| 28.06.2015 15:00 - 16:00 | 0 | 0 | 0 | 0 |
| 28.06.2015 16:00 - 17:00 | 0 | 0 | 0 | 0 |
| 28.06.2015 17:00 - 18:00 | 0 | 0 | 0 | 0 |
| 28.06.2015 18:00 - 19:00 | 0 | 0 | 0 | 0 |
| 28.06.2015 19:00 - 20:00 | 0 | -50 | 0 | 0 |
| 28.06.2015 20:00 - 21:00 | 0 | -50 | 0 | 0 |
| 28.06.2015 21:00 - 22:00 | 0 | -50 | 0 | 0 |
| 28.06.2015 22:00 - 23:00 | 0 | -50 | 0 | 0 |
| 28.06.2015 23:00 - 24:00 | 0 | -50 | 0 | 0 |
| 29.06.2015 00:00 - 01:00 | 0 | -50 | 0 | 0 |
| 29.06.2015 01:00 - 02:00 | 0 | -50 | 0 | 0 |
| 29.06.2015 02:00 - 03:00 | 0 | -50 | 0 | 0 |
| 29.06.2015 03:00 - 04:00 | 0 | -50 | 0 | 0 |
| 29.06.2015 04:00 - 05:00 | 0 | -50 | 0 | 0 |
| 29.06.2015 05:00 - 06:00 | 0 | -50 | 0 | 0 |
| 29.06.2015 06:00 - 07:00 | 0 | 0 | 0 | 0 |
| 29.06.2015 07:00 - 08:00 | 0 | 0 | 0 | 0 |
| 29.06.2015 08:00 - 09:00 | 0 | 0 | 0 | 0 |
| 29.06.2015 09:00 - 10:00 | 0 | 0 | 0 | 0 |
| 29.06.2015 10:00 - 11:00 | 0 | 0 | 0 | 0 |
| 29.06.2015 11:00 - 12:00 | 0 | 0 | 0 | 0 |
| 29.06.2015 12:00 - 13:00 | 0 | 0 | 0 | 0 |
| 29.06.2015 13:00 - 14:00 | 0 | 0 | 0 | 0 |
| 29.06.2015 14:00 - 15:00 | 0 | 0 | 0 | 0 |
| 29.06.2015 15:00 - 16:00 | 0 | 0 | 0 | 0 |
| 29.06.2015 16:00 - 17:00 | 0 | 0 | 0 | 0 |
| 29.06.2015 17:00 - 18:00 | 0 | 0 | 0 | 0 |
| 29.06.2015 18:00 - 19:00 | 0 | 0 | 0 | 0 |
| 29.06.2015 19:00 - 20:00 | 0 | 0 | 0 | 0 |
| 29.06.2015 20:00 - 21:00 | 0 | 0 | 0 | 0 |
| 29.06.2015 21:00 - 22:00 | 0 | 0 | 0 | 0 |
| 29.06.2015 22:00 - 23:00 | 0 | 0 | 0 | 0 |
| 29.06.2015 23:00 - 24:00 | 0 | 0 | 0 | 0 |
| 30.06.2015 00:00 - 01:00 | 0 | 0 | 0 | 0 |
| 30.06.2015 01:00 - 02:00 | 50 | 0 | 0 | 0 |
| 30.06.2015 02:00 - 03:00 | 50 | 0 | 0 | 0 |
| 30.06.2015 03:00 - 04:00 | 50 | 0 | 0 | 0 |
| 30.06.2015 04:00 - 05:00 | 50 | 0 | 0 | 0 |
| 30.06.2015 05:00 - 06:00 | 50 | 0 | 0 | 0 |
| 30.06.2015 06:00 - 07:00 | 0 | 0 | 0 | 0 |
| 30.06.2015 07:00 - 08:00 | 0 | 0 | 0 | 0 |
| 30.06.2015 08:00 - 09:00 | 0 | 0 | 0 | 0 |
| 30.06.2015 09:00 - 10:00 | 0 | 0 | 0 | 0 |
| 30.06.2015 10:00 - 11:00 | 0 | 0 | 0 | 0 |
| 30.06.2015 11:00 - 12:00 | 0 | 0 | 0 | 0 |
| 30.06.2015 12:00 - 13:00 | 0 | 0 | 0 | 0 |
| 30.06.2015 13:00 - 14:00 | 0 | 0 | 0 | 0 |
| 30.06.2015 14:00 - 15:00 | 0 | 0 | 0 | 0 |
| 30.06.2015 15:00 - 16:00 | 0 | 0 | 0 | 0 |
| 30.06.2015 16:00 - 17:00 | 0 | 0 | 0 | 0 |
| 30.06.2015 17:00 - 18:00 | 0 | 0 | 0 | 0 |
| 30.06.2015 18:00 - 19:00 | 0 | 0 | 0 | 0 |
| 30.06.2015 19:00 - 20:00 | 0 | 0 | 0 | 0 |
| 30.06.2015 20:00 - 21:00 | 0 | 0 | 0 | 0 |
| 30.06.2015 21:00 - 22:00 | 0 | 0 | 0 | 0 |
| 30.06.2015 22:00 - 23:00 | 0 | 0 | 0 | 0 |
| 30.06.2015 23:00 - 24:00 | 0 | 0 | 0 | 0 |
| 01.07.2015 00:00 - 01:00 | 0 | 0 | 0 | 0 |
| 01.07.2015 01:00 - 02:00 | 0 | 0 | 0 | 0 |
| 01.07.2015 02:00 - 03:00 | 0 | 0 | 0 | 0 |
| 01.07.2015 03:00 - 04:00 | 0 | 0 | 0 | 0 |
| 01.07.2015 04:00 - 05:00 | 0 | 0 | 0 | 0 |